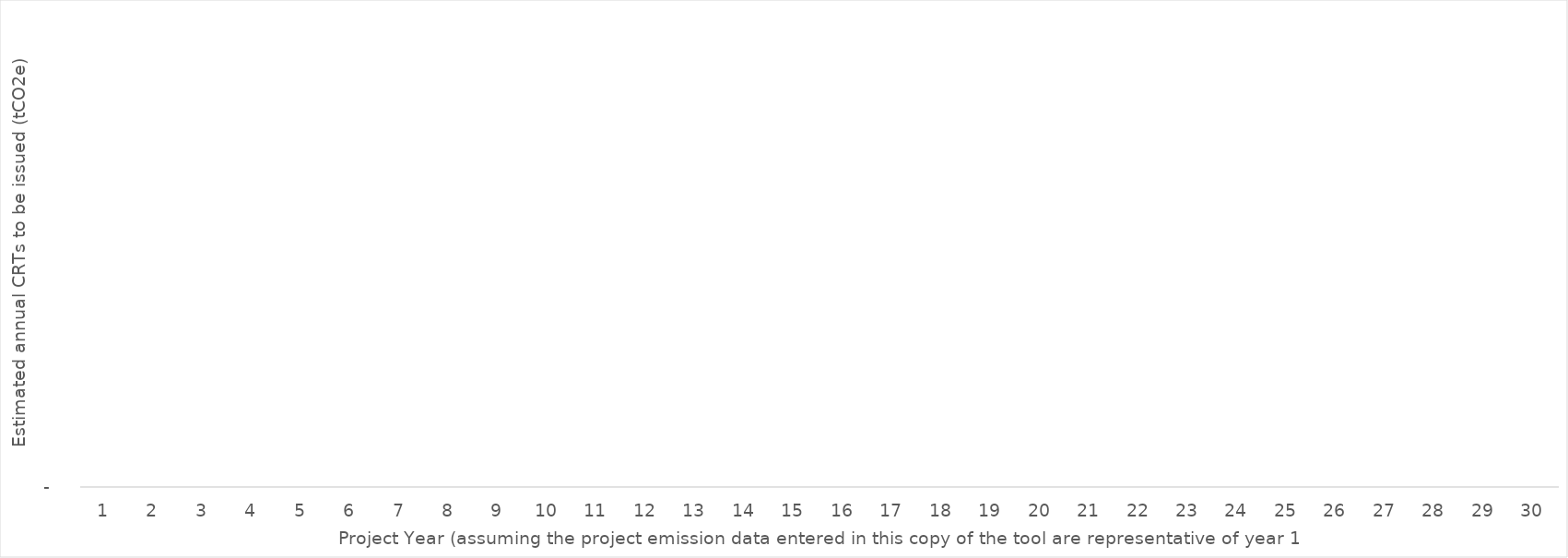
| Category | ESTIMATED Annual CRTs to be issued |
|---|---|
| 1.0 | 0 |
| 2.0 | 0 |
| 3.0 | 0 |
| 4.0 | 0 |
| 5.0 | 0 |
| 6.0 | 0 |
| 7.0 | 0 |
| 8.0 | 0 |
| 9.0 | 0 |
| 10.0 | 0 |
| 11.0 | 0 |
| 12.0 | 0 |
| 13.0 | 0 |
| 14.0 | 0 |
| 15.0 | 0 |
| 16.0 | 0 |
| 17.0 | 0 |
| 18.0 | 0 |
| 19.0 | 0 |
| 20.0 | 0 |
| 21.0 | 0 |
| 22.0 | 0 |
| 23.0 | 0 |
| 24.0 | 0 |
| 25.0 | 0 |
| 26.0 | 0 |
| 27.0 | 0 |
| 28.0 | 0 |
| 29.0 | 0 |
| 30.0 | 0 |